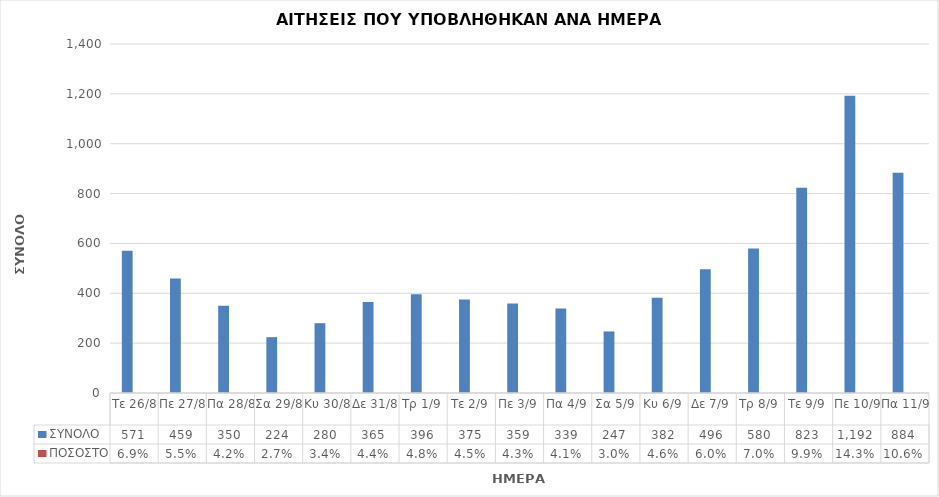
| Category | ΣΥΝΟΛΟ | ΠΟΣΟΣΤΟ |
|---|---|---|
| Τε 26/8 | 571 | 0.069 |
| Πε 27/8 | 459 | 0.055 |
| Πα 28/8 | 350 | 0.042 |
| Σα 29/8 | 224 | 0.027 |
| Κυ 30/8 | 280 | 0.034 |
| Δε 31/8 | 365 | 0.044 |
| Τρ 1/9 | 396 | 0.048 |
| Τε 2/9 | 375 | 0.045 |
| Πε 3/9 | 359 | 0.043 |
| Πα 4/9 | 339 | 0.041 |
| Σα 5/9 | 247 | 0.03 |
| Κυ 6/9 | 382 | 0.046 |
| Δε 7/9 | 496 | 0.06 |
| Τρ 8/9 | 580 | 0.07 |
| Τε 9/9 | 823 | 0.099 |
| Πε 10/9 | 1192 | 0.143 |
| Πα 11/9 | 884 | 0.106 |